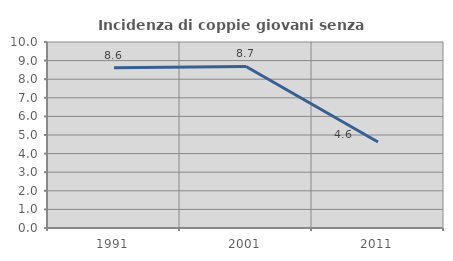
| Category | Incidenza di coppie giovani senza figli |
|---|---|
| 1991.0 | 8.621 |
| 2001.0 | 8.683 |
| 2011.0 | 4.626 |